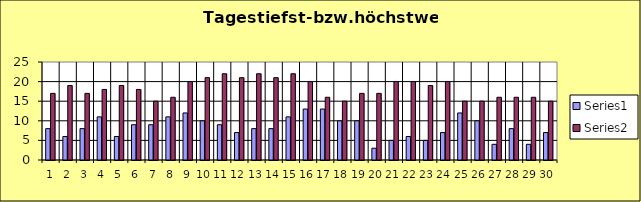
| Category | Series 0 | Series 1 |
|---|---|---|
| 0 | 8 | 17 |
| 1 | 6 | 19 |
| 2 | 8 | 17 |
| 3 | 11 | 18 |
| 4 | 6 | 19 |
| 5 | 9 | 18 |
| 6 | 9 | 15 |
| 7 | 11 | 16 |
| 8 | 12 | 20 |
| 9 | 10 | 21 |
| 10 | 9 | 22 |
| 11 | 7 | 21 |
| 12 | 8 | 22 |
| 13 | 8 | 21 |
| 14 | 11 | 22 |
| 15 | 13 | 20 |
| 16 | 13 | 16 |
| 17 | 10 | 15 |
| 18 | 10 | 17 |
| 19 | 3 | 17 |
| 20 | 5 | 20 |
| 21 | 6 | 20 |
| 22 | 5 | 19 |
| 23 | 7 | 20 |
| 24 | 12 | 15 |
| 25 | 10 | 15 |
| 26 | 4 | 16 |
| 27 | 8 | 16 |
| 28 | 4 | 16 |
| 29 | 7 | 15 |